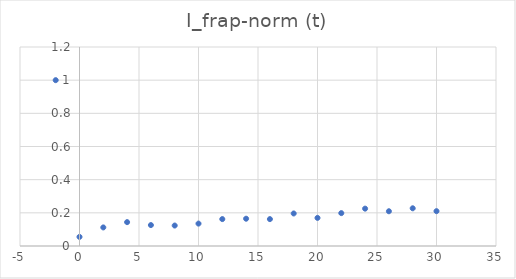
| Category | I_frap-norm (t) |
|---|---|
| -2.0 | 1 |
| 0.0 | 0.055 |
| 2.0 | 0.112 |
| 4.0 | 0.144 |
| 6.0 | 0.126 |
| 8.0 | 0.123 |
| 10.0 | 0.135 |
| 12.0 | 0.162 |
| 14.0 | 0.165 |
| 16.0 | 0.162 |
| 18.0 | 0.196 |
| 20.0 | 0.169 |
| 22.0 | 0.198 |
| 24.0 | 0.225 |
| 26.0 | 0.21 |
| 28.0 | 0.227 |
| 30.0 | 0.21 |